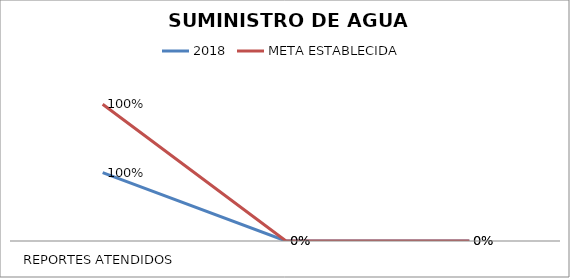
| Category | 2018 | META ESTABLECIDA |
|---|---|---|
| REPORTES ATENDIDOS | 1 | 1 |